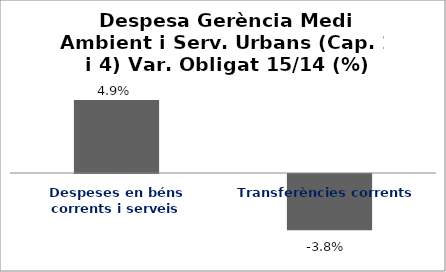
| Category | Series 0 |
|---|---|
| Despeses en béns corrents i serveis | 0.049 |
| Transferències corrents | -0.038 |